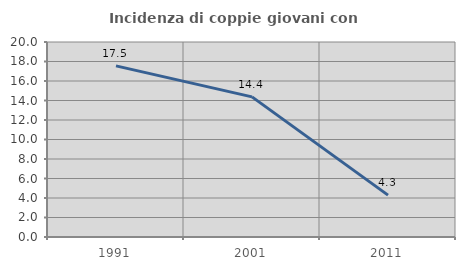
| Category | Incidenza di coppie giovani con figli |
|---|---|
| 1991.0 | 17.55 |
| 2001.0 | 14.371 |
| 2011.0 | 4.294 |